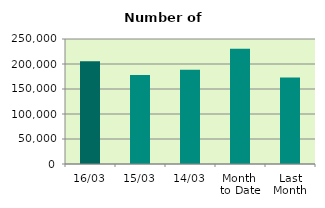
| Category | Series 0 |
|---|---|
| 16/03 | 205650 |
| 15/03 | 177912 |
| 14/03 | 188362 |
| Month 
to Date | 230332 |
| Last
Month | 173197.3 |